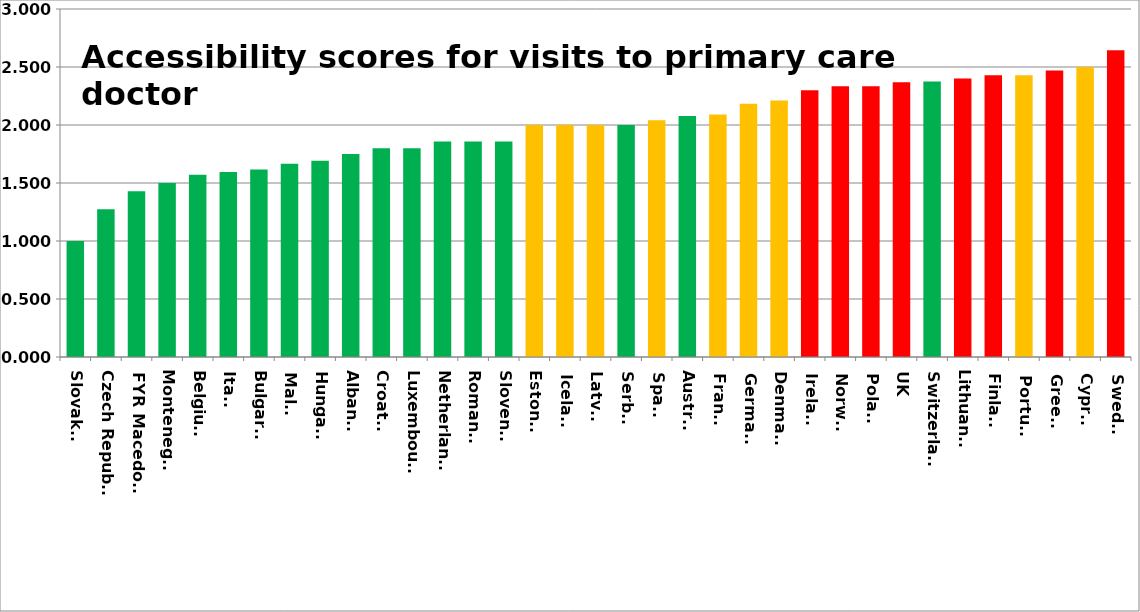
| Category | Series 0 |
|---|---|
| Slovakia | 1 |
| Czech Republic | 1.273 |
| FYR Macedonia | 1.429 |
| Montenegro | 1.5 |
| Belgium | 1.571 |
| Italy | 1.595 |
| Bulgaria | 1.615 |
| Malta | 1.667 |
| Hungary | 1.692 |
| Albania | 1.75 |
| Croatia | 1.8 |
| Luxembourg | 1.8 |
| Netherlands | 1.857 |
| Romania | 1.857 |
| Slovenia | 1.857 |
| Estonia | 2 |
| Iceland | 2 |
| Latvia | 2 |
| Serbia | 2 |
| Spain | 2.042 |
| Austria | 2.077 |
| France | 2.091 |
| Germany | 2.183 |
| Denmark | 2.211 |
| Ireland | 2.3 |
| Norway | 2.333 |
| Poland | 2.333 |
| UK | 2.37 |
| Switzerland | 2.375 |
| Lithuania | 2.4 |
| Finland | 2.429 |
| Portugal | 2.429 |
| Greece | 2.471 |
| Cyprus | 2.5 |
| Sweden | 2.644 |